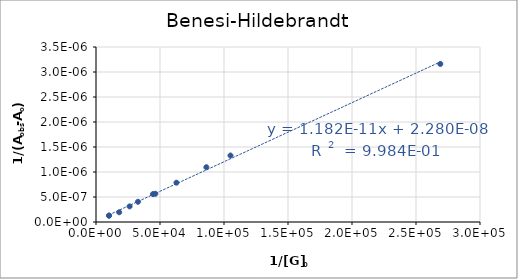
| Category | 405 nm |
|---|---|
| 268992.0 | 0 |
| 105075.0 | 0 |
| 86215.38461538462 | 0 |
| 62848.59813084113 | 0 |
| 46377.93103448276 | 0 |
| 44535.09933774835 | 0 |
| 32803.902439024394 | 0 |
| 26268.75 | 0 |
| 18126.145552560647 | 0 |
| 10173.676248108924 | 0 |
| 10173.676248108924 | 0 |